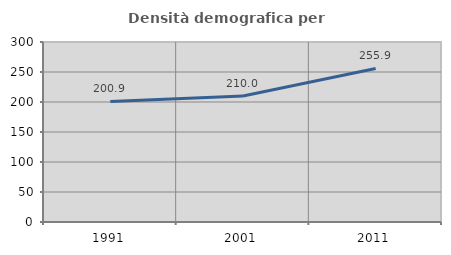
| Category | Densità demografica |
|---|---|
| 1991.0 | 200.938 |
| 2001.0 | 210.031 |
| 2011.0 | 255.851 |